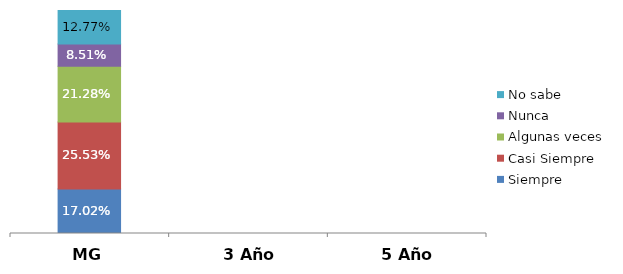
| Category | Siempre | Casi Siempre | Algunas veces | Nunca | No sabe |
|---|---|---|---|---|---|
| MG | 0.17 | 0.255 | 0.213 | 0.085 | 0.128 |
| 3 Año | 0 | 0 | 0 | 0 | 0 |
| 5 Año | 0 | 0 | 0 | 0 | 0 |